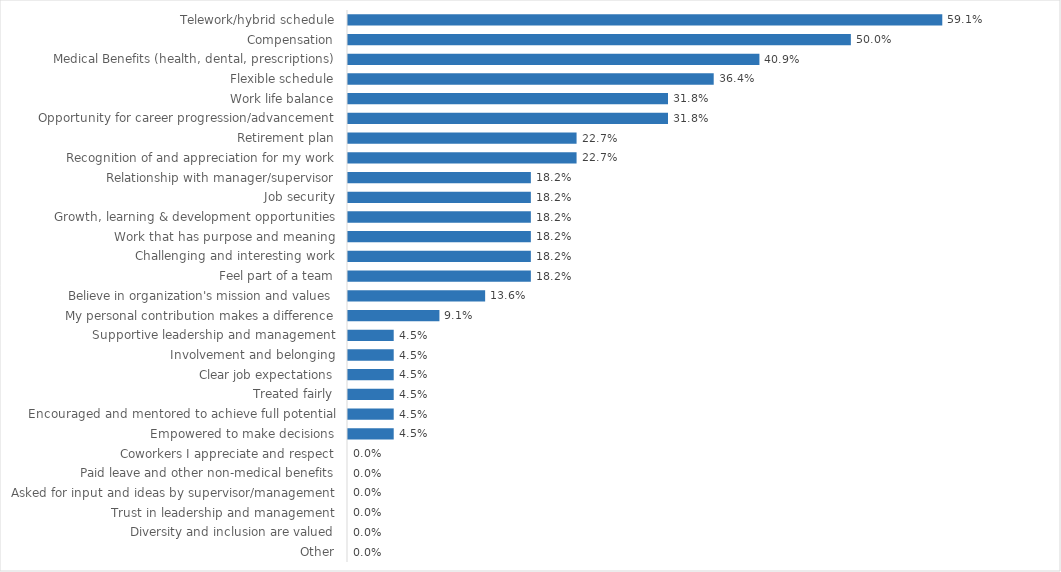
| Category | Finance & Management |
|---|---|
| Telework/hybrid schedule | 0.591 |
| Compensation | 0.5 |
| Medical Benefits (health, dental, prescriptions) | 0.409 |
| Flexible schedule | 0.364 |
| Work life balance | 0.318 |
| Opportunity for career progression/advancement | 0.318 |
| Retirement plan | 0.227 |
| Recognition of and appreciation for my work | 0.227 |
| Relationship with manager/supervisor | 0.182 |
| Job security | 0.182 |
| Growth, learning & development opportunities | 0.182 |
| Work that has purpose and meaning | 0.182 |
| Challenging and interesting work | 0.182 |
| Feel part of a team | 0.182 |
| Believe in organization's mission and values | 0.136 |
| My personal contribution makes a difference | 0.091 |
| Supportive leadership and management | 0.045 |
| Involvement and belonging | 0.045 |
| Clear job expectations | 0.045 |
| Treated fairly | 0.045 |
| Encouraged and mentored to achieve full potential | 0.045 |
| Empowered to make decisions | 0.045 |
| Coworkers I appreciate and respect | 0 |
| Paid leave and other non-medical benefits | 0 |
| Asked for input and ideas by supervisor/management | 0 |
| Trust in leadership and management | 0 |
| Diversity and inclusion are valued | 0 |
| Other | 0 |